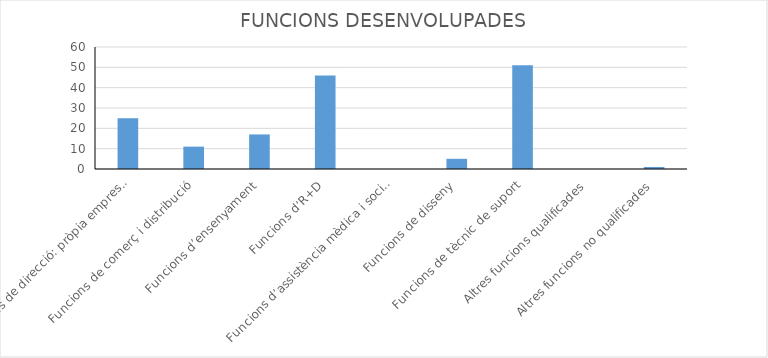
| Category | Series 0 |
|---|---|
| Funcions de direcció: pròpia empresa, direcció, producció, financera, etc. | 25 |
| Funcions de comerç i distribució | 11 |
| Funcions d’ensenyament | 17 |
| Funcions d’R+D | 46 |
| Funcions d’assistència mèdica i social | 0 |
| Funcions de disseny | 5 |
| Funcions de tècnic de suport | 51 |
| Altres funcions qualificades | 0 |
| Altres funcions no qualificades | 1 |